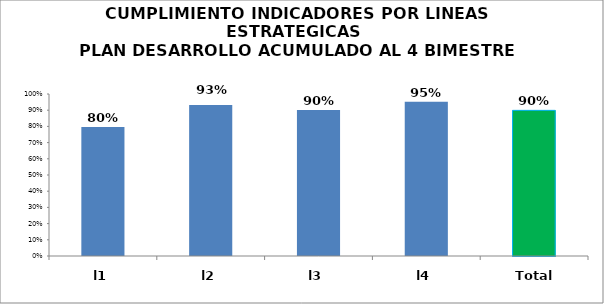
| Category | CUMPLIMIENTO |
|---|---|
| l1 | 0.796 |
| l2 | 0.933 |
| l3 | 0.902 |
| l4 | 0.952 |
| Total | 0.899 |